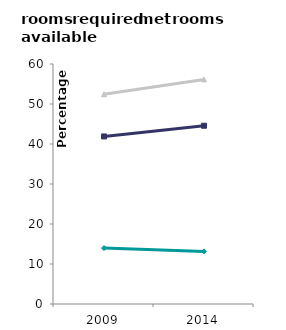
| Category | owner occupied | private rented | social renters |
|---|---|---|---|
| 2009.0 | 13.978 | 41.891 | 52.431 |
| 2014.0 | 13.153 | 44.564 | 56.146 |